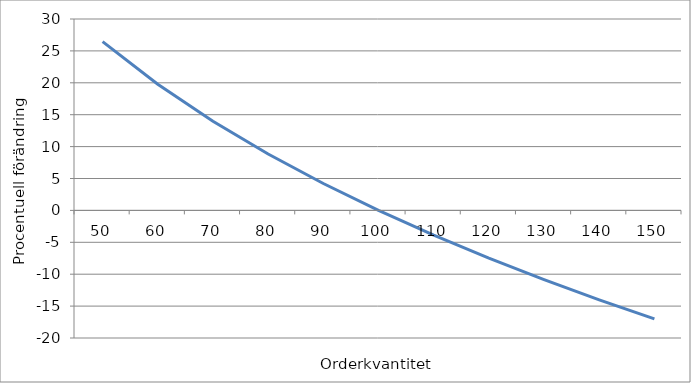
| Category | Series 0 |
|---|---|
| 50.0 | 26.457 |
| 60.0 | 19.777 |
| 70.0 | 13.982 |
| 80.0 | 8.845 |
| 90.0 | 4.218 |
| 100.0 | 0 |
| 110.0 | -3.884 |
| 120.0 | -7.489 |
| 130.0 | -10.856 |
| 140.0 | -14.021 |
| 150.0 | -17.007 |